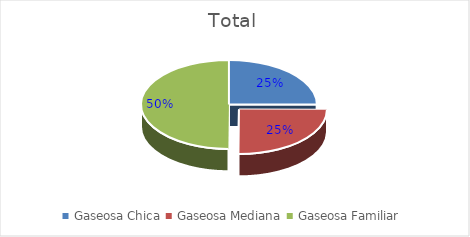
| Category | Total |
|---|---|
| Gaseosa Chica | 220234 |
| Gaseosa Mediana | 220440 |
| Gaseosa Familiar | 438945 |